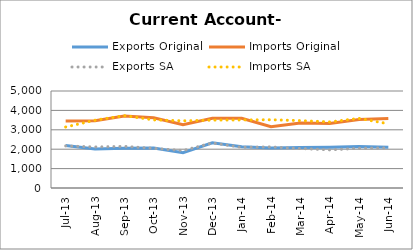
| Category | Exports Original | Imports Original | Exports SA | Imports SA |
|---|---|---|---|---|
| 2013-07-11 | 2194 | 3458 | 2169 | 3144 |
| 2013-08-11 | 2009 | 3468 | 2115 | 3494 |
| 2013-09-11 | 2054 | 3715 | 2145 | 3730 |
| 2013-10-11 | 2063 | 3617 | 2046 | 3511 |
| 2013-11-11 | 1820 | 3265 | 1930 | 3462 |
| 2013-12-11 | 2327 | 3594 | 2322 | 3499 |
| 2014-01-11 | 2129 | 3596 | 2097 | 3508 |
| 2014-02-11 | 2058 | 3159 | 2119 | 3518 |
| 2014-03-11 | 2092 | 3354 | 2036 | 3474 |
| 2014-04-11 | 2097 | 3329 | 1964 | 3406 |
| 2014-05-11 | 2133 | 3531 | 2047 | 3587 |
| 2014-06-11 | 2102 | 3582 | 2069 | 3311 |